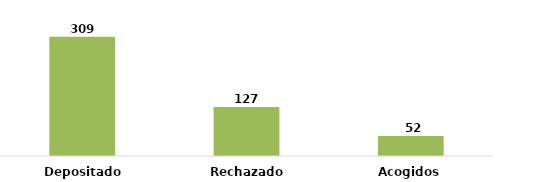
| Category | Series 0 |
|---|---|
| Depositados | 309 |
| Rechazados | 127 |
| Acogidos | 52 |